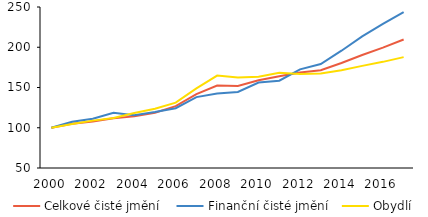
| Category | Celkové čisté jmění | Finanční čisté jmění | Obydlí |
|---|---|---|---|
| 2000 | 100 | 100 | 100 |
| 2001 | 104.847 | 107.361 | 104.696 |
| 2002 | 107.721 | 111.126 | 108.852 |
| 2003 | 111.788 | 118.596 | 112.22 |
| 2004 | 114.134 | 115.544 | 118.24 |
| 2005 | 118.723 | 119.522 | 123.62 |
| 2006 | 126.88 | 124.27 | 131.203 |
| 2007 | 141.75 | 138.045 | 148.965 |
| 2008 | 152.398 | 142.417 | 164.814 |
| 2009 | 151.976 | 144.539 | 162.369 |
| 2010 | 159.042 | 156.219 | 163.35 |
| 2011 | 164.084 | 158.408 | 168.191 |
| 2012 | 168.703 | 172.517 | 166.861 |
| 2013 | 171.486 | 179.158 | 167.509 |
| 2014 | 180.448 | 195.704 | 171.366 |
| 2015 | 190.31 | 213.446 | 176.858 |
| 2016 | 199.458 | 228.908 | 181.861 |
| 2017 | 209.648 | 243.704 | 187.72 |